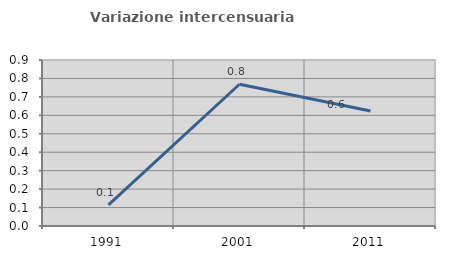
| Category | Variazione intercensuaria annua |
|---|---|
| 1991.0 | 0.115 |
| 2001.0 | 0.769 |
| 2011.0 | 0.623 |